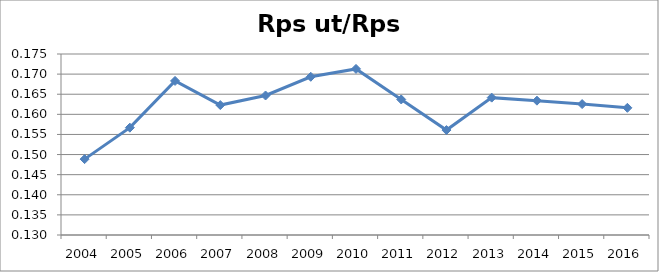
| Category | Rps ut/Rps in |
|---|---|
| 2004.0 | 0.149 |
| 2005.0 | 0.157 |
| 2006.0 | 0.168 |
| 2007.0 | 0.162 |
| 2008.0 | 0.165 |
| 2009.0 | 0.169 |
| 2010.0 | 0.171 |
| 2011.0 | 0.164 |
| 2012.0 | 0.156 |
| 2013.0 | 0.164 |
| 2014.0 | 0.163 |
| 2015.0 | 0.163 |
| 2016.0 | 0.162 |